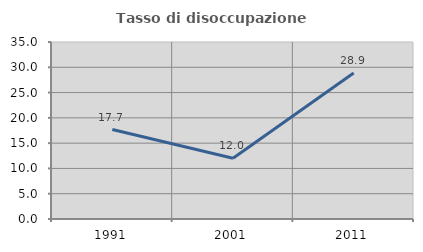
| Category | Tasso di disoccupazione giovanile  |
|---|---|
| 1991.0 | 17.683 |
| 2001.0 | 12 |
| 2011.0 | 28.866 |